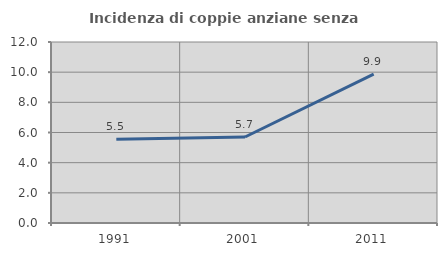
| Category | Incidenza di coppie anziane senza figli  |
|---|---|
| 1991.0 | 5.544 |
| 2001.0 | 5.702 |
| 2011.0 | 9.876 |